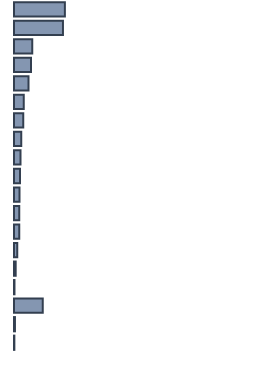
| Category | Percentatge |
|---|---|
| 0 | 21.2 |
| 1 | 20.4 |
| 2 | 7.6 |
| 3 | 7.1 |
| 4 | 6 |
| 5 | 4.1 |
| 6 | 3.9 |
| 7 | 3 |
| 8 | 2.7 |
| 9 | 2.5 |
| 10 | 2.3 |
| 11 | 2.2 |
| 12 | 2.2 |
| 13 | 1.4 |
| 14 | 0.7 |
| 15 | 0.2 |
| 16 | 12 |
| 17 | 0.4 |
| 18 | 0.152 |